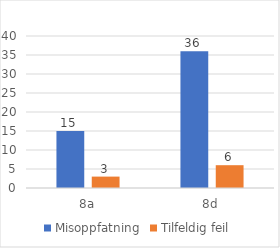
| Category | Misoppfatning | Tilfeldig feil |
|---|---|---|
| 8a | 15 | 3 |
| 8d | 36 | 6 |